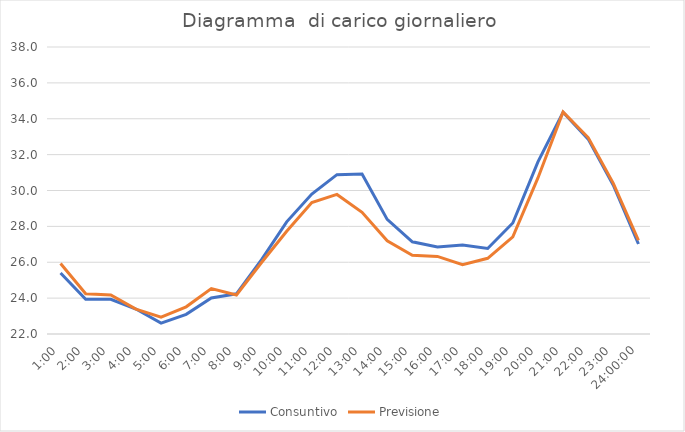
| Category | Consuntivo | Previsione |
|---|---|---|
| 0.041666666666666664 | 25.405 | 25.926 |
| 0.08333333333333333 | 23.935 | 24.248 |
| 0.125 | 23.935 | 24.178 |
| 0.16666666666666666 | 23.39 | 23.388 |
| 0.20833333333333334 | 22.604 | 22.942 |
| 0.25 | 23.097 | 23.516 |
| 0.2916666666666667 | 24.007 | 24.532 |
| 0.3333333333333333 | 24.24 | 24.173 |
| 0.375 | 26.152 | 25.988 |
| 0.4166666666666667 | 28.253 | 27.724 |
| 0.4583333333333333 | 29.804 | 29.327 |
| 0.5 | 30.883 | 29.781 |
| 0.5416666666666666 | 30.92 | 28.781 |
| 0.5833333333333334 | 28.39 | 27.195 |
| 0.625 | 27.143 | 26.394 |
| 0.6666666666666666 | 26.851 | 26.326 |
| 0.7083333333333334 | 26.962 | 25.869 |
| 0.75 | 26.77 | 26.221 |
| 0.7916666666666666 | 28.187 | 27.414 |
| 0.8333333333333334 | 31.598 | 30.701 |
| 0.875 | 34.364 | 34.376 |
| 0.9166666666666666 | 32.863 | 32.951 |
| 0.9583333333333334 | 30.296 | 30.398 |
| 1900-01-01 | 27.016 | 27.227 |